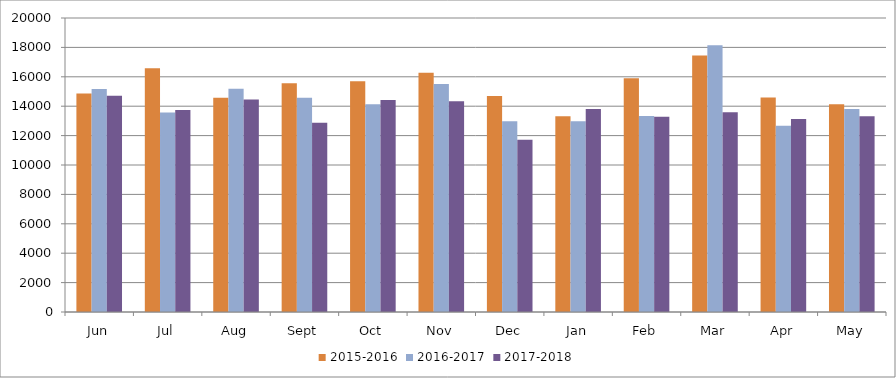
| Category | 2015-2016 | 2016-2017 | 2017-2018 |
|---|---|---|---|
| Jun | 14858 | 15169 | 14704 |
| Jul | 16575 | 13577 | 13749 |
| Aug | 14570 | 15189 | 14461 |
| Sept | 15555 | 14567 | 12866 |
| Oct | 15699 | 14125 | 14429 |
| Nov | 16278 | 15503 | 14344 |
| Dec | 14698 | 12978 | 11722 |
| Jan | 13322 | 12978 | 13809 |
| Feb | 15901 | 13326 | 13279 |
| Mar | 17447 | 18147 | 13585 |
| Apr | 14599 | 12665 | 13128 |
| May | 14139 | 13815 | 13323 |